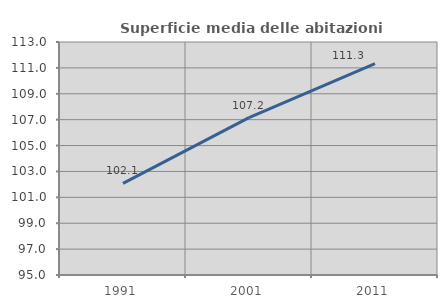
| Category | Superficie media delle abitazioni occupate |
|---|---|
| 1991.0 | 102.078 |
| 2001.0 | 107.154 |
| 2011.0 | 111.321 |